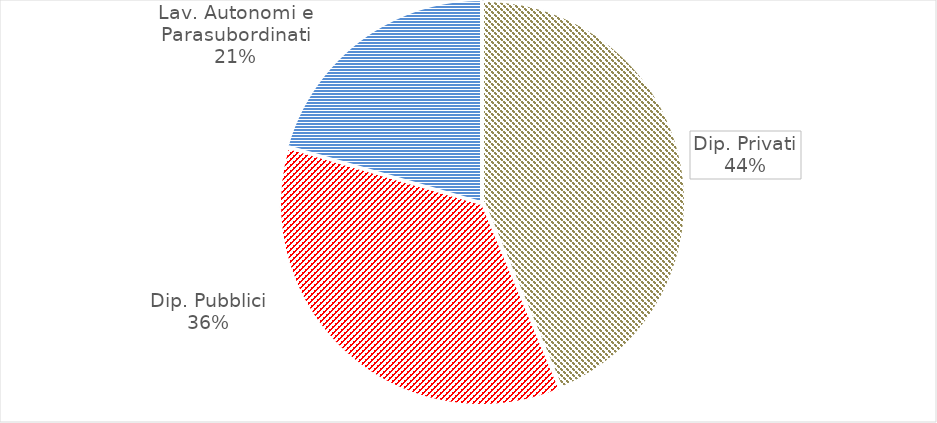
| Category | Series 0 |
|---|---|
| Dip. Privati | 48738 |
| Dip. Pubblici | 39936 |
| Lav. Autonomi e Parasubordinati | 22887 |